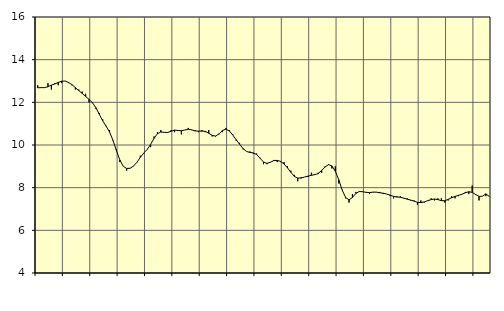
| Category | Piggar | Tillverkning av verkstadsvaror, SNI 25-30, 33 |
|---|---|---|
| nan | 12.8 | 12.68 |
| 87.0 | 12.7 | 12.69 |
| 87.0 | 12.7 | 12.69 |
| 87.0 | 12.9 | 12.73 |
| nan | 12.6 | 12.81 |
| 88.0 | 12.9 | 12.86 |
| 88.0 | 12.8 | 12.93 |
| 88.0 | 12.9 | 12.99 |
| nan | 13 | 13 |
| 89.0 | 12.9 | 12.93 |
| 89.0 | 12.8 | 12.83 |
| 89.0 | 12.6 | 12.69 |
| nan | 12.6 | 12.55 |
| 90.0 | 12.5 | 12.42 |
| 90.0 | 12.4 | 12.28 |
| 90.0 | 12 | 12.14 |
| nan | 12 | 11.98 |
| 91.0 | 11.7 | 11.75 |
| 91.0 | 11.5 | 11.44 |
| 91.0 | 11.2 | 11.13 |
| nan | 10.9 | 10.88 |
| 92.0 | 10.7 | 10.61 |
| 92.0 | 10.2 | 10.22 |
| 92.0 | 9.8 | 9.74 |
| nan | 9.2 | 9.3 |
| 93.0 | 9 | 9 |
| 93.0 | 8.8 | 8.9 |
| 93.0 | 8.9 | 8.91 |
| nan | 9 | 9.01 |
| 94.0 | 9.2 | 9.19 |
| 94.0 | 9.5 | 9.42 |
| 94.0 | 9.6 | 9.62 |
| nan | 9.8 | 9.79 |
| 95.0 | 9.9 | 10.03 |
| 95.0 | 10.4 | 10.31 |
| 95.0 | 10.6 | 10.53 |
| nan | 10.7 | 10.61 |
| 96.0 | 10.6 | 10.59 |
| 96.0 | 10.6 | 10.59 |
| 96.0 | 10.7 | 10.64 |
| nan | 10.6 | 10.7 |
| 97.0 | 10.7 | 10.68 |
| 97.0 | 10.5 | 10.67 |
| 97.0 | 10.7 | 10.7 |
| nan | 10.8 | 10.74 |
| 98.0 | 10.7 | 10.71 |
| 98.0 | 10.7 | 10.66 |
| 98.0 | 10.6 | 10.65 |
| nan | 10.7 | 10.65 |
| 99.0 | 10.6 | 10.64 |
| 99.0 | 10.7 | 10.55 |
| 99.0 | 10.4 | 10.45 |
| nan | 10.4 | 10.42 |
| 0.0 | 10.5 | 10.52 |
| 0.0 | 10.6 | 10.68 |
| 0.0 | 10.8 | 10.74 |
| nan | 10.7 | 10.66 |
| 1.0 | 10.5 | 10.47 |
| 1.0 | 10.2 | 10.25 |
| 1.0 | 10.1 | 10.04 |
| nan | 9.8 | 9.84 |
| 2.0 | 9.7 | 9.7 |
| 2.0 | 9.7 | 9.65 |
| 2.0 | 9.6 | 9.63 |
| nan | 9.6 | 9.55 |
| 3.0 | 9.4 | 9.38 |
| 3.0 | 9.1 | 9.2 |
| 3.0 | 9.1 | 9.14 |
| nan | 9.2 | 9.19 |
| 4.0 | 9.3 | 9.27 |
| 4.0 | 9.2 | 9.28 |
| 4.0 | 9.2 | 9.23 |
| nan | 9.2 | 9.11 |
| 5.0 | 9 | 8.93 |
| 5.0 | 8.8 | 8.72 |
| 5.0 | 8.6 | 8.53 |
| nan | 8.3 | 8.45 |
| 6.0 | 8.5 | 8.45 |
| 6.0 | 8.5 | 8.5 |
| 6.0 | 8.5 | 8.54 |
| nan | 8.7 | 8.58 |
| 7.0 | 8.6 | 8.61 |
| 7.0 | 8.7 | 8.66 |
| 7.0 | 8.7 | 8.81 |
| nan | 9 | 8.97 |
| 8.0 | 9.1 | 9.08 |
| 8.0 | 8.9 | 9.02 |
| 8.0 | 9 | 8.77 |
| nan | 8.2 | 8.37 |
| 9.0 | 7.9 | 7.89 |
| 9.0 | 7.5 | 7.54 |
| 9.0 | 7.3 | 7.43 |
| nan | 7.7 | 7.54 |
| 10.0 | 7.8 | 7.73 |
| 10.0 | 7.8 | 7.82 |
| 10.0 | 7.8 | 7.81 |
| nan | 7.8 | 7.78 |
| 11.0 | 7.7 | 7.77 |
| 11.0 | 7.8 | 7.79 |
| 11.0 | 7.8 | 7.79 |
| nan | 7.8 | 7.76 |
| 12.0 | 7.7 | 7.74 |
| 12.0 | 7.7 | 7.7 |
| 12.0 | 7.6 | 7.65 |
| nan | 7.5 | 7.59 |
| 13.0 | 7.6 | 7.56 |
| 13.0 | 7.6 | 7.55 |
| 13.0 | 7.5 | 7.51 |
| nan | 7.5 | 7.46 |
| 14.0 | 7.4 | 7.42 |
| 14.0 | 7.4 | 7.37 |
| 14.0 | 7.2 | 7.31 |
| nan | 7.4 | 7.3 |
| 15.0 | 7.3 | 7.33 |
| 15.0 | 7.4 | 7.39 |
| 15.0 | 7.5 | 7.44 |
| nan | 7.4 | 7.47 |
| 16.0 | 7.5 | 7.44 |
| 16.0 | 7.5 | 7.39 |
| 16.0 | 7.3 | 7.39 |
| nan | 7.4 | 7.45 |
| 17.0 | 7.6 | 7.53 |
| 17.0 | 7.5 | 7.59 |
| 17.0 | 7.6 | 7.64 |
| nan | 7.7 | 7.69 |
| 18.0 | 7.8 | 7.76 |
| 18.0 | 7.7 | 7.81 |
| 18.0 | 8.1 | 7.78 |
| nan | 7.7 | 7.68 |
| 19.0 | 7.4 | 7.59 |
| 19.0 | 7.6 | 7.6 |
| 19.0 | 7.6 | 7.71 |
| nan | 7.6 | 7.59 |